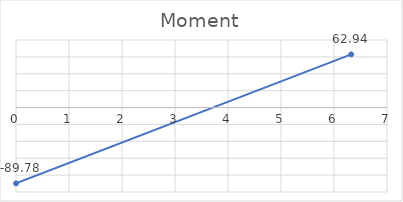
| Category | Series 0 |
|---|---|
| 0.0 | -89.777 |
| 6.324555320336759 | 62.944 |